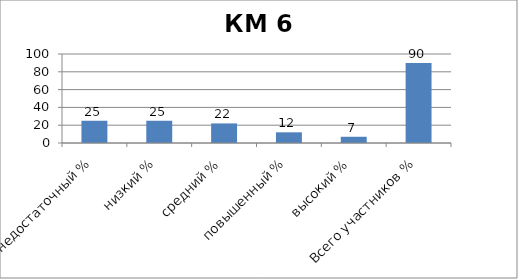
| Category | Series 0 |
|---|---|
| недостаточный % | 25 |
| низкий % | 25 |
| средний % | 22 |
| повышенный % | 12 |
| высокий % | 7 |
| Всего участников % | 90 |